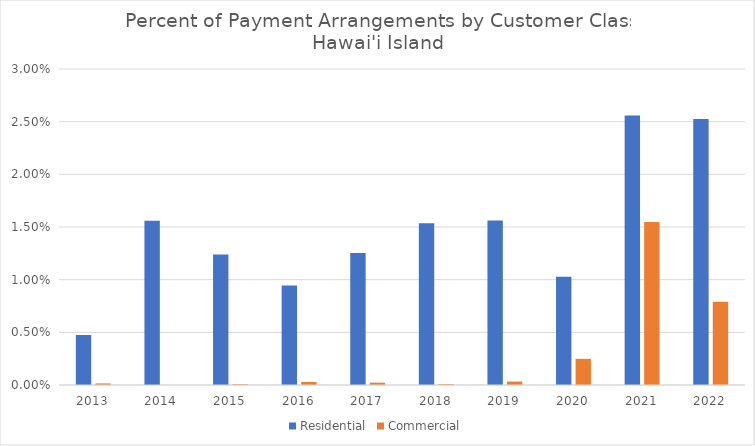
| Category | Residential | Commercial |
|---|---|---|
| 2013.0 | 0.005 | 0 |
| 2014.0 | 0.016 | 0 |
| 2015.0 | 0.012 | 0 |
| 2016.0 | 0.009 | 0 |
| 2017.0 | 0.013 | 0 |
| 2018.0 | 0.015 | 0 |
| 2019.0 | 0.016 | 0 |
| 2020.0 | 0.01 | 0.002 |
| 2021.0 | 0.026 | 0.015 |
| 2022.0 | 0.025 | 0.008 |